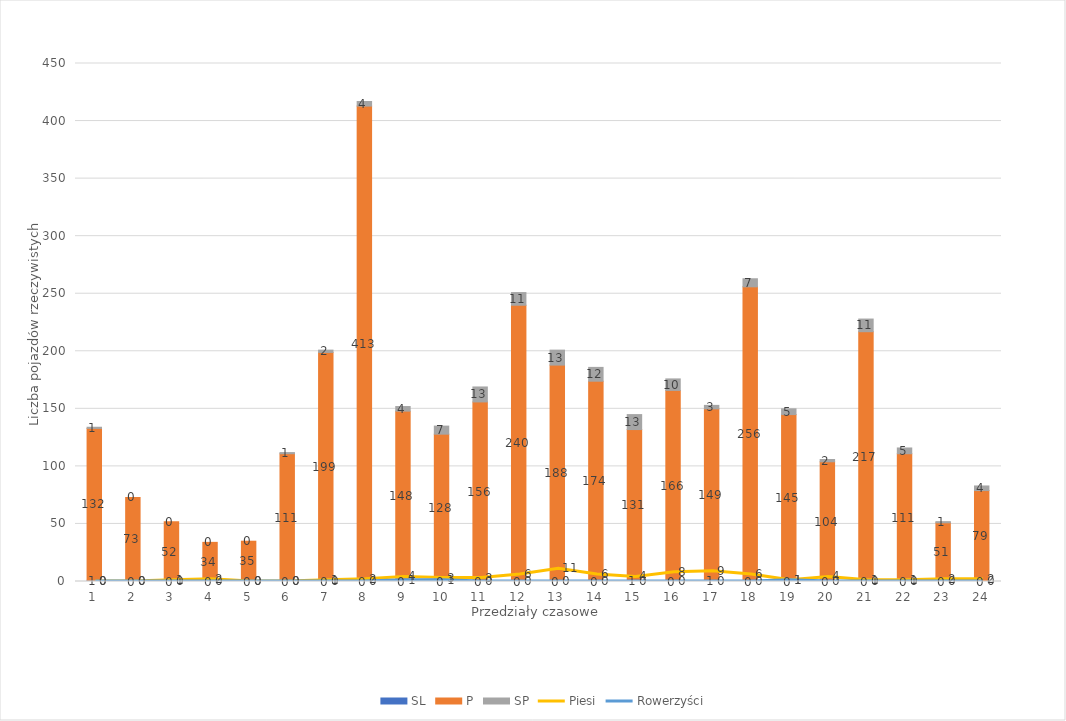
| Category | SL | P | SP |
|---|---|---|---|
| 0 | 1 | 132 | 1 |
| 1 | 0 | 73 | 0 |
| 2 | 0 | 52 | 0 |
| 3 | 0 | 34 | 0 |
| 4 | 0 | 35 | 0 |
| 5 | 0 | 111 | 1 |
| 6 | 0 | 199 | 2 |
| 7 | 0 | 413 | 4 |
| 8 | 0 | 148 | 4 |
| 9 | 0 | 128 | 7 |
| 10 | 0 | 156 | 13 |
| 11 | 0 | 240 | 11 |
| 12 | 0 | 188 | 13 |
| 13 | 0 | 174 | 12 |
| 14 | 1 | 131 | 13 |
| 15 | 0 | 166 | 10 |
| 16 | 1 | 149 | 3 |
| 17 | 0 | 256 | 7 |
| 18 | 0 | 145 | 5 |
| 19 | 0 | 104 | 2 |
| 20 | 0 | 217 | 11 |
| 21 | 0 | 111 | 5 |
| 22 | 0 | 51 | 1 |
| 23 | 0 | 79 | 4 |